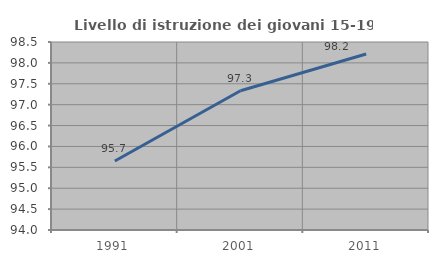
| Category | Livello di istruzione dei giovani 15-19 anni |
|---|---|
| 1991.0 | 95.652 |
| 2001.0 | 97.333 |
| 2011.0 | 98.214 |